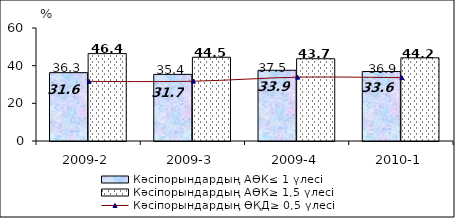
| Category | Кәсіпорындардың АӨК≤ 1 үлесі | Кәсіпорындардың АӨК≥ 1,5 үлесі |
|---|---|---|
| 2009-2 | 36.293 | 46.397 |
| 2009-3 | 35.38 | 44.464 |
| 2009-4 | 37.55 | 43.675 |
| 2010-1 | 36.906 | 44.162 |